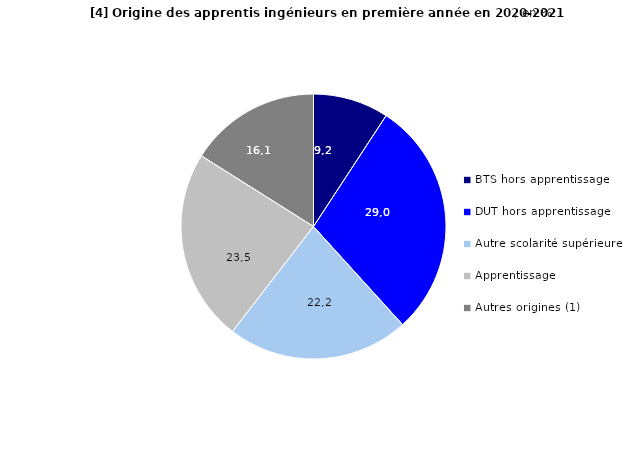
| Category | Series 0 |
|---|---|
| BTS hors apprentissage | 9.23 |
| DUT hors apprentissage | 29.04 |
| Autre scolarité supérieure | 22.19 |
| Apprentissage  | 23.49 |
| Autres origines (1) | 16.05 |